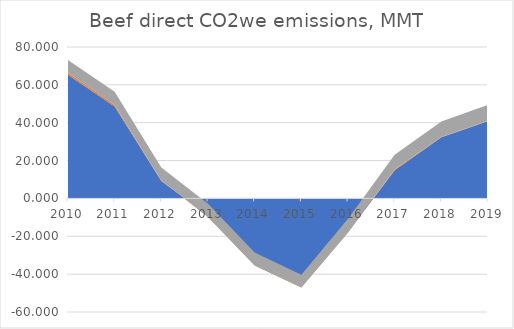
| Category | Enteric CH4 | Manure CH4 | Manure N2O |
|---|---|---|---|
| 2010.0 | 65.374 | 1.084 | 6.704 |
| 2011.0 | 48.557 | 0.962 | 6.864 |
| 2012.0 | 9.258 | 0.239 | 6.837 |
| 2013.0 | -9.152 | -0.61 | 6.89 |
| 2014.0 | -34.033 | -1.449 | 6.89 |
| 2015.0 | -45.923 | -1.194 | 6.837 |
| 2016.0 | -17.841 | -0.106 | 7.208 |
| 2017.0 | 14.856 | 0.619 | 7.606 |
| 2018.0 | 32.326 | 0.14 | 8.215 |
| 2019.0 | 40.827 | 0.262 | 8.348 |